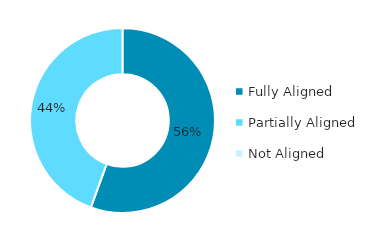
| Category | Series 0 |
|---|---|
| Fully Aligned | 0.556 |
| Partially Aligned | 0.444 |
| Not Aligned | 0 |